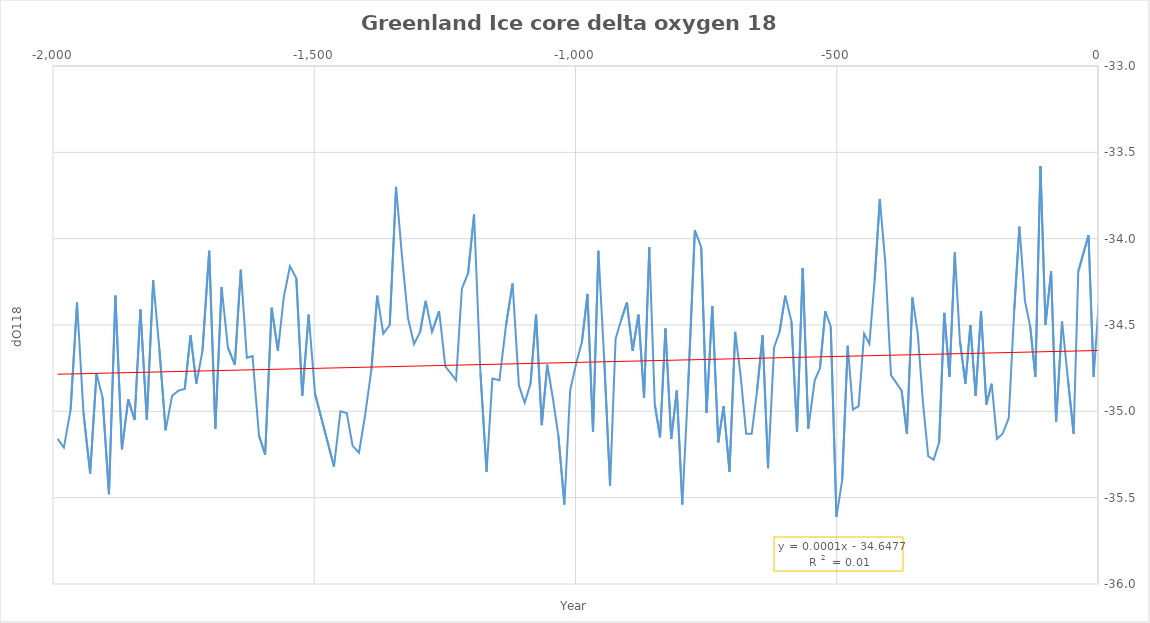
| Category | Series 0 |
|---|---|
| 1.349999999999909 | -34.37 |
| -8.299999999999955 | -34.8 |
| -18.170000000000073 | -33.98 |
| -37.75 | -34.19 |
| -46.61999999999989 | -35.13 |
| -57.710000000000036 | -34.81 |
| -68.68000000000006 | -34.48 |
| -80.18000000000006 | -35.06 |
| -89.75 | -34.19 |
| -100.5 | -34.5 |
| -110.15999999999985 | -33.58 |
| -119.82000000000016 | -34.8 |
| -129.69999999999982 | -34.51 |
| -139.80999999999995 | -34.36 |
| -150.42999999999984 | -33.93 |
| -160.26999999999998 | -34.41 |
| -170.86000000000013 | -35.04 |
| -182.55999999999995 | -35.13 |
| -193.3800000000001 | -35.16 |
| -203.55000000000018 | -34.84 |
| -213.63999999999987 | -34.96 |
| -223.82999999999993 | -34.42 |
| -234.17000000000007 | -34.91 |
| -244.23999999999978 | -34.5 |
| -253.76000000000022 | -34.84 |
| -264.3000000000002 | -34.59 |
| -274.0 | -34.08 |
| -284.15999999999985 | -34.8 |
| -294.1500000000001 | -34.43 |
| -304.0 | -35.18 |
| -314.5500000000002 | -35.28 |
| -324.9000000000001 | -35.26 |
| -334.9499999999998 | -34.95 |
| -344.9499999999998 | -34.55 |
| -355.1100000000001 | -34.34 |
| -365.73 | -35.13 |
| -375.84000000000015 | -34.88 |
| -396.1999999999998 | -34.79 |
| -407.07000000000016 | -34.14 |
| -417.5799999999999 | -33.77 |
| -427.4499999999998 | -34.24 |
| -437.6100000000001 | -34.61 |
| -447.6300000000001 | -34.55 |
| -458.0999999999999 | -34.97 |
| -469.07000000000016 | -34.99 |
| -479.0 | -34.62 |
| -489.6700000000001 | -35.4 |
| -500.5799999999999 | -35.61 |
| -511.5 | -34.51 |
| -521.9000000000001 | -34.42 |
| -532.0799999999999 | -34.75 |
| -542.1500000000001 | -34.82 |
| -554.5300000000002 | -35.1 |
| -565.1300000000001 | -34.17 |
| -576.0 | -35.12 |
| -586.69 | -34.48 |
| -598.4499999999998 | -34.33 |
| -609.46 | -34.54 |
| -619.9499999999998 | -34.63 |
| -631.4000000000001 | -35.33 |
| -641.8899999999999 | -34.56 |
| -652.48 | -34.88 |
| -662.7600000000002 | -35.13 |
| -673.3899999999999 | -35.13 |
| -684.04 | -34.79 |
| -694.3499999999999 | -34.54 |
| -705.25 | -35.35 |
| -716.5500000000002 | -34.97 |
| -726.6999999999998 | -35.18 |
| -738.1999999999998 | -34.39 |
| -749.1700000000001 | -35.01 |
| -759.3600000000001 | -34.05 |
| -771.5300000000002 | -33.95 |
| -784.3200000000002 | -34.85 |
| -795.52 | -35.54 |
| -806.1399999999999 | -34.88 |
| -816.7399999999998 | -35.16 |
| -827.81 | -34.52 |
| -838.1399999999999 | -35.15 |
| -848.2600000000002 | -34.96 |
| -858.6999999999998 | -34.05 |
| -868.75 | -34.92 |
| -879.5300000000002 | -34.44 |
| -890.6300000000001 | -34.65 |
| -901.5999999999999 | -34.37 |
| -912.5 | -34.47 |
| -923.2600000000002 | -34.58 |
| -933.7800000000002 | -35.43 |
| -945.06 | -34.7 |
| -956.19 | -34.07 |
| -966.5 | -35.12 |
| -977.0500000000002 | -34.32 |
| -987.8000000000002 | -34.6 |
| -998.5900000000001 | -34.72 |
| -1010.23 | -34.88 |
| -1021.23 | -35.54 |
| -1032.81 | -35.14 |
| -1043.0 | -34.93 |
| -1054.0 | -34.73 |
| -1064.56 | -35.08 |
| -1075.44 | -34.44 |
| -1086.12 | -34.84 |
| -1097.1599999999999 | -34.95 |
| -1108.31 | -34.85 |
| -1120.4099999999999 | -34.26 |
| -1132.92 | -34.5 |
| -1145.6 | -34.82 |
| -1159.0 | -34.81 |
| -1170.17 | -35.35 |
| -1181.8899999999999 | -34.78 |
| -1194.15 | -33.86 |
| -1205.54 | -34.2 |
| -1217.4499999999998 | -34.29 |
| -1228.5700000000002 | -34.82 |
| -1238.5 | -34.78 |
| -1249.1399999999999 | -34.74 |
| -1260.9299999999998 | -34.42 |
| -1274.6799999999998 | -34.54 |
| -1286.71 | -34.36 |
| -1297.3899999999999 | -34.54 |
| -1309.0500000000002 | -34.61 |
| -1320.63 | -34.46 |
| -1332.44 | -34.09 |
| -1343.35 | -33.7 |
| -1355.4899999999998 | -34.5 |
| -1367.85 | -34.55 |
| -1379.4 | -34.33 |
| -1390.6999999999998 | -34.76 |
| -1403.0500000000002 | -35.03 |
| -1414.38 | -35.24 |
| -1426.5700000000002 | -35.2 |
| -1437.8200000000002 | -35.01 |
| -1449.88 | -35 |
| -1462.19 | -35.32 |
| -1498.4099999999999 | -34.9 |
| -1510.6799999999998 | -34.44 |
| -1522.9099999999999 | -34.91 |
| -1534.29 | -34.23 |
| -1546.5 | -34.16 |
| -1558.4 | -34.34 |
| -1569.4899999999998 | -34.65 |
| -1581.52 | -34.4 |
| -1593.9699999999998 | -35.25 |
| -1605.81 | -35.14 |
| -1618.1100000000001 | -34.68 |
| -1629.0 | -34.69 |
| -1640.56 | -34.18 |
| -1652.0300000000002 | -34.73 |
| -1665.2800000000002 | -34.63 |
| -1677.3200000000002 | -34.28 |
| -1689.3000000000002 | -35.1 |
| -1701.06 | -34.07 |
| -1713.9299999999998 | -34.65 |
| -1725.5900000000001 | -34.84 |
| -1736.7199999999998 | -34.56 |
| -1747.83 | -34.87 |
| -1760.0300000000002 | -34.88 |
| -1772.0700000000002 | -34.91 |
| -1784.5 | -35.11 |
| -1796.38 | -34.64 |
| -1808.1999999999998 | -34.24 |
| -1820.44 | -35.05 |
| -1832.6799999999998 | -34.41 |
| -1843.87 | -35.05 |
| -1855.92 | -34.93 |
| -1868.0900000000001 | -35.22 |
| -1880.56 | -34.33 |
| -1892.9099999999999 | -35.48 |
| -1905.1799999999998 | -34.92 |
| -1916.8200000000002 | -34.78 |
| -1928.8600000000001 | -35.36 |
| -1941.6 | -35.01 |
| -1953.94 | -34.37 |
| -1966.31 | -34.99 |
| -1979.1999999999998 | -35.21 |
| -1991.12 | -35.16 |